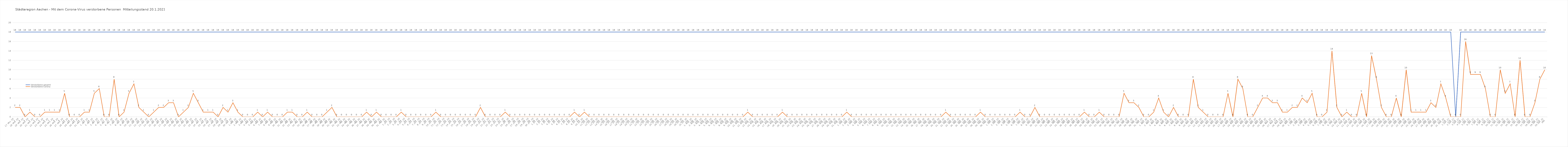
| Category | Verstorbene gesamt | Verstorbene Corona |
|---|---|---|
| 0 | 18 | 2 |
| 1 | 18 | 2 |
| 2 | 18 | 0 |
| 3 | 18 | 1 |
| 4 | 18 | 0 |
| 5 | 18 | 0 |
| 6 | 18 | 1 |
| 7 | 18 | 1 |
| 8 | 18 | 1 |
| 9 | 18 | 1 |
| 10 | 18 | 5 |
| 11 | 18 | 0 |
| 12 | 18 | 0 |
| 13 | 18 | 0 |
| 14 | 18 | 1 |
| 15 | 18 | 1 |
| 16 | 18 | 5 |
| 17 | 18 | 6 |
| 18 | 18 | 0 |
| 19 | 18 | 0 |
| 20 | 18 | 8 |
| 21 | 18 | 0 |
| 22 | 18 | 1 |
| 23 | 18 | 5 |
| 24 | 18 | 7 |
| 25 | 18 | 2 |
| 26 | 18 | 1 |
| 27 | 18 | 0 |
| 28 | 18 | 1 |
| 29 | 18 | 2 |
| 30 | 18 | 2 |
| 31 | 18 | 3 |
| 32 | 18 | 3 |
| 33 | 18 | 0 |
| 34 | 18 | 1 |
| 35 | 18 | 2 |
| 36 | 18 | 5 |
| 37 | 18 | 3 |
| 38 | 18 | 1 |
| 39 | 18 | 1 |
| 40 | 18 | 1 |
| 41 | 18 | 0 |
| 42 | 18 | 2 |
| 43 | 18 | 1 |
| 44 | 18 | 3 |
| 45 | 18 | 1 |
| 46 | 18 | 0 |
| 47 | 18 | 0 |
| 48 | 18 | 0 |
| 49 | 18 | 1 |
| 50 | 18 | 0 |
| 51 | 18 | 1 |
| 52 | 18 | 0 |
| 53 | 18 | 0 |
| 54 | 18 | 0 |
| 55 | 18 | 1 |
| 56 | 18 | 1 |
| 57 | 18 | 0 |
| 58 | 18 | 0 |
| 59 | 18 | 1 |
| 60 | 18 | 0 |
| 61 | 18 | 0 |
| 62 | 18 | 0 |
| 63 | 18 | 1 |
| 64 | 18 | 2 |
| 65 | 18 | 0 |
| 66 | 18 | 0 |
| 67 | 18 | 0 |
| 68 | 18 | 0 |
| 69 | 18 | 0 |
| 70 | 18 | 0 |
| 71 | 18 | 1 |
| 72 | 18 | 0 |
| 73 | 18 | 1 |
| 74 | 18 | 0 |
| 75 | 18 | 0 |
| 76 | 18 | 0 |
| 77 | 18 | 0 |
| 78 | 18 | 1 |
| 79 | 18 | 0 |
| 80 | 18 | 0 |
| 81 | 18 | 0 |
| 82 | 18 | 0 |
| 83 | 18 | 0 |
| 84 | 18 | 0 |
| 85 | 18 | 1 |
| 86 | 18 | 0 |
| 87 | 18 | 0 |
| 88 | 18 | 0 |
| 89 | 18 | 0 |
| 90 | 18 | 0 |
| 91 | 18 | 0 |
| 92 | 18 | 0 |
| 93 | 18 | 0 |
| 94 | 18 | 2 |
| 95 | 18 | 0 |
| 96 | 18 | 0 |
| 97 | 18 | 0 |
| 98 | 18 | 0 |
| 99 | 18 | 1 |
| 100 | 18 | 0 |
| 101 | 18 | 0 |
| 102 | 18 | 0 |
| 103 | 18 | 0 |
| 104 | 18 | 0 |
| 105 | 18 | 0 |
| 106 | 18 | 0 |
| 107 | 18 | 0 |
| 108 | 18 | 0 |
| 109 | 18 | 0 |
| 110 | 18 | 0 |
| 111 | 18 | 0 |
| 112 | 18 | 0 |
| 113 | 18 | 1 |
| 114 | 18 | 0 |
| 115 | 18 | 1 |
| 116 | 18 | 0 |
| 117 | 18 | 0 |
| 118 | 18 | 0 |
| 119 | 18 | 0 |
| 120 | 18 | 0 |
| 121 | 18 | 0 |
| 122 | 18 | 0 |
| 123 | 18 | 0 |
| 124 | 18 | 0 |
| 125 | 18 | 0 |
| 126 | 18 | 0 |
| 127 | 18 | 0 |
| 128 | 18 | 0 |
| 129 | 18 | 0 |
| 130 | 18 | 0 |
| 131 | 18 | 0 |
| 132 | 18 | 0 |
| 133 | 18 | 0 |
| 134 | 18 | 0 |
| 135 | 18 | 0 |
| 136 | 18 | 0 |
| 137 | 18 | 0 |
| 138 | 18 | 0 |
| 139 | 18 | 0 |
| 140 | 18 | 0 |
| 141 | 18 | 0 |
| 142 | 18 | 0 |
| 143 | 18 | 0 |
| 144 | 18 | 0 |
| 145 | 18 | 0 |
| 146 | 18 | 0 |
| 147 | 18 | 0 |
| 148 | 18 | 1 |
| 149 | 18 | 0 |
| 150 | 18 | 0 |
| 151 | 18 | 0 |
| 152 | 18 | 0 |
| 153 | 18 | 0 |
| 154 | 18 | 0 |
| 155 | 18 | 1 |
| 156 | 18 | 0 |
| 157 | 18 | 0 |
| 158 | 18 | 0 |
| 159 | 18 | 0 |
| 160 | 18 | 0 |
| 161 | 18 | 0 |
| 162 | 18 | 0 |
| 163 | 18 | 0 |
| 164 | 18 | 0 |
| 165 | 18 | 0 |
| 166 | 18 | 0 |
| 167 | 18 | 0 |
| 168 | 18 | 1 |
| 169 | 18 | 0 |
| 170 | 18 | 0 |
| 171 | 18 | 0 |
| 172 | 18 | 0 |
| 173 | 18 | 0 |
| 174 | 18 | 0 |
| 175 | 18 | 0 |
| 176 | 18 | 0 |
| 177 | 18 | 0 |
| 178 | 18 | 0 |
| 179 | 18 | 0 |
| 180 | 18 | 0 |
| 181 | 18 | 0 |
| 182 | 18 | 0 |
| 183 | 18 | 0 |
| 184 | 18 | 0 |
| 185 | 18 | 0 |
| 186 | 18 | 0 |
| 187 | 18 | 0 |
| 188 | 18 | 1 |
| 189 | 18 | 0 |
| 190 | 18 | 0 |
| 191 | 18 | 0 |
| 192 | 18 | 0 |
| 193 | 18 | 0 |
| 194 | 18 | 0 |
| 195 | 18 | 1 |
| 196 | 18 | 0 |
| 197 | 18 | 0 |
| 198 | 18 | 0 |
| 199 | 18 | 0 |
| 200 | 18 | 0 |
| 201 | 18 | 0 |
| 202 | 18 | 0 |
| 203 | 18 | 1 |
| 204 | 18 | 0 |
| 205 | 18 | 0 |
| 206 | 18 | 2 |
| 207 | 18 | 0 |
| 208 | 18 | 0 |
| 209 | 18 | 0 |
| 210 | 18 | 0 |
| 211 | 18 | 0 |
| 212 | 18 | 0 |
| 213 | 18 | 0 |
| 214 | 18 | 0 |
| 215 | 18 | 0 |
| 216 | 18 | 1 |
| 217 | 18 | 0 |
| 218 | 18 | 0 |
| 219 | 18 | 1 |
| 220 | 18 | 0 |
| 221 | 18 | 0 |
| 222 | 18 | 0 |
| 223 | 18 | 0 |
| 224 | 18 | 5 |
| 225 | 18 | 3 |
| 226 | 18 | 3 |
| 227 | 18 | 2 |
| 228 | 18 | 0 |
| 229 | 18 | 0 |
| 230 | 18 | 1 |
| 231 | 18 | 4 |
| 232 | 18 | 1 |
| 233 | 18 | 0 |
| 234 | 18 | 2 |
| 235 | 18 | 0 |
| 236 | 18 | 0 |
| 237 | 18 | 0 |
| 238 | 18 | 8 |
| 239 | 18 | 2 |
| 240 | 18 | 1 |
| 241 | 18 | 0 |
| 242 | 18 | 0 |
| 243 | 18 | 0 |
| 244 | 18 | 0 |
| 245 | 18 | 5 |
| 246 | 18 | 0 |
| 247 | 18 | 8 |
| 248 | 18 | 6 |
| 249 | 18 | 0 |
| 250 | 18 | 0 |
| 251 | 18 | 2 |
| 252 | 18 | 4 |
| 253 | 18 | 4 |
| 254 | 18 | 3 |
| 255 | 18 | 3 |
| 256 | 18 | 1 |
| 257 | 18 | 1 |
| 258 | 18 | 2 |
| 259 | 18 | 2 |
| 260 | 18 | 4 |
| 261 | 18 | 3 |
| 262 | 18 | 5 |
| 263 | 18 | 0 |
| 264 | 18 | 0 |
| 265 | 18 | 1 |
| 266 | 18 | 14 |
| 267 | 18 | 2 |
| 268 | 18 | 0 |
| 269 | 18 | 1 |
| 270 | 18 | 0 |
| 271 | 18 | 0 |
| 272 | 18 | 5 |
| 273 | 18 | 0 |
| 274 | 18 | 13 |
| 275 | 18 | 8 |
| 276 | 18 | 2 |
| 277 | 18 | 0 |
| 278 | 18 | 0 |
| 279 | 18 | 4 |
| 280 | 18 | 0 |
| 281 | 18 | 10 |
| 282 | 18 | 1 |
| 283 | 18 | 1 |
| 284 | 18 | 1 |
| 285 | 18 | 1 |
| 286 | 18 | 3 |
| 287 | 18 | 2 |
| 288 | 18 | 7 |
| 289 | 18 | 4 |
| 290 | 18 | 0 |
| 291 | 0 | 0 |
| 292 | 18 | 0 |
| 293 | 18 | 16 |
| 294 | 18 | 9 |
| 295 | 18 | 9 |
| 296 | 18 | 9 |
| 297 | 18 | 6 |
| 298 | 18 | 0 |
| 299 | 18 | 0 |
| 300 | 18 | 10 |
| 301 | 18 | 5 |
| 302 | 18 | 7 |
| 303 | 18 | 0 |
| 304 | 18 | 12 |
| 305 | 18 | 0 |
| 306 | 18 | 0 |
| 307 | 18 | 3 |
| 308 | 18 | 8 |
| 309 | 18 | 10 |